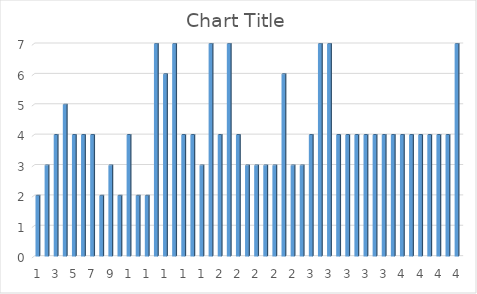
| Category | Series 0 |
|---|---|
| 0 | 2 |
| 1 | 3 |
| 2 | 4 |
| 3 | 5 |
| 4 | 4 |
| 5 | 4 |
| 6 | 4 |
| 7 | 2 |
| 8 | 3 |
| 9 | 2 |
| 10 | 4 |
| 11 | 2 |
| 12 | 2 |
| 13 | 7 |
| 14 | 6 |
| 15 | 7 |
| 16 | 4 |
| 17 | 4 |
| 18 | 3 |
| 19 | 7 |
| 20 | 4 |
| 21 | 7 |
| 22 | 4 |
| 23 | 3 |
| 24 | 3 |
| 25 | 3 |
| 26 | 3 |
| 27 | 6 |
| 28 | 3 |
| 29 | 3 |
| 30 | 4 |
| 31 | 7 |
| 32 | 7 |
| 33 | 4 |
| 34 | 4 |
| 35 | 4 |
| 36 | 4 |
| 37 | 4 |
| 38 | 4 |
| 39 | 4 |
| 40 | 4 |
| 41 | 4 |
| 42 | 4 |
| 43 | 4 |
| 44 | 4 |
| 45 | 4 |
| 46 | 7 |